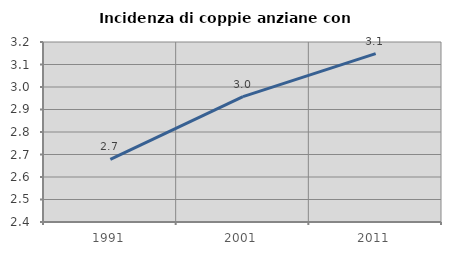
| Category | Incidenza di coppie anziane con figli |
|---|---|
| 1991.0 | 2.679 |
| 2001.0 | 2.957 |
| 2011.0 | 3.148 |